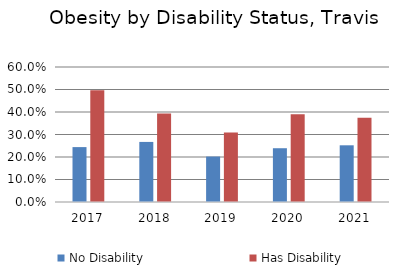
| Category | No Disability | Has Disability |
|---|---|---|
| 2017.0 | 0.244 | 0.497 |
| 2018.0 | 0.267 | 0.393 |
| 2019.0 | 0.202 | 0.309 |
| 2020.0 | 0.239 | 0.39 |
| 2021.0 | 0.252 | 0.375 |